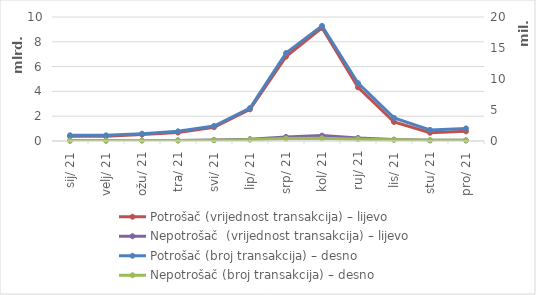
| Category | Potrošač (vrijednost transakcija) – lijevo | Nepotrošač  (vrijednost transakcija) – lijevo |
|---|---|---|
| 2021-01-01 | 378273689 | 23520260 |
| 2021-02-01 | 377676277 | 27864590 |
| 2021-03-01 | 517933074 | 38004655 |
| 2021-04-01 | 683045012 | 48259875 |
| 2021-05-01 | 1112472557 | 74316977 |
| 2021-06-01 | 2555545635 | 142098215 |
| 2021-07-01 | 6805294363 | 327090658 |
| 2021-08-01 | 9132892789 | 433745149 |
| 2021-09-01 | 4326179593 | 239272872 |
| 2021-10-01 | 1534363257 | 111864804 |
| 2021-11-01 | 667005525 | 56103848 |
| 2021-12-01 | 779737969 | 52221742 |